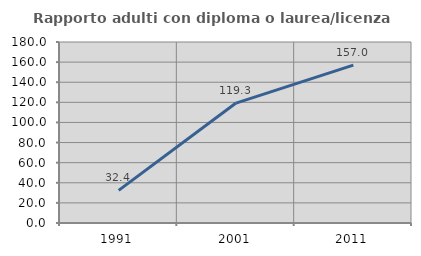
| Category | Rapporto adulti con diploma o laurea/licenza media  |
|---|---|
| 1991.0 | 32.425 |
| 2001.0 | 119.281 |
| 2011.0 | 156.997 |